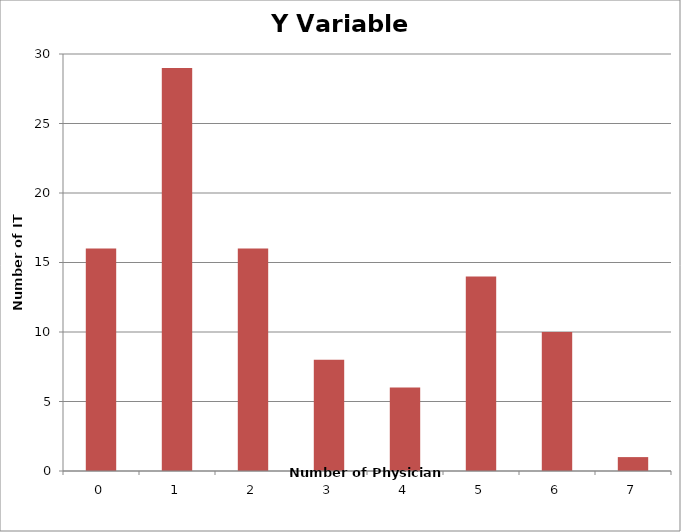
| Category | Series 0 |
|---|---|
| 0.0 | 16 |
| 1.0 | 29 |
| 2.0 | 16 |
| 3.0 | 8 |
| 4.0 | 6 |
| 5.0 | 14 |
| 6.0 | 10 |
| 7.0 | 1 |